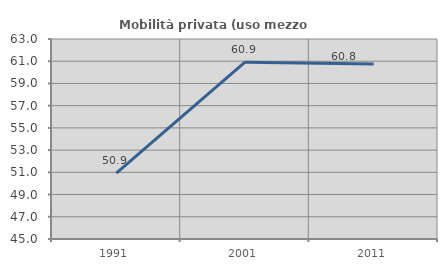
| Category | Mobilità privata (uso mezzo privato) |
|---|---|
| 1991.0 | 50.924 |
| 2001.0 | 60.909 |
| 2011.0 | 60.755 |